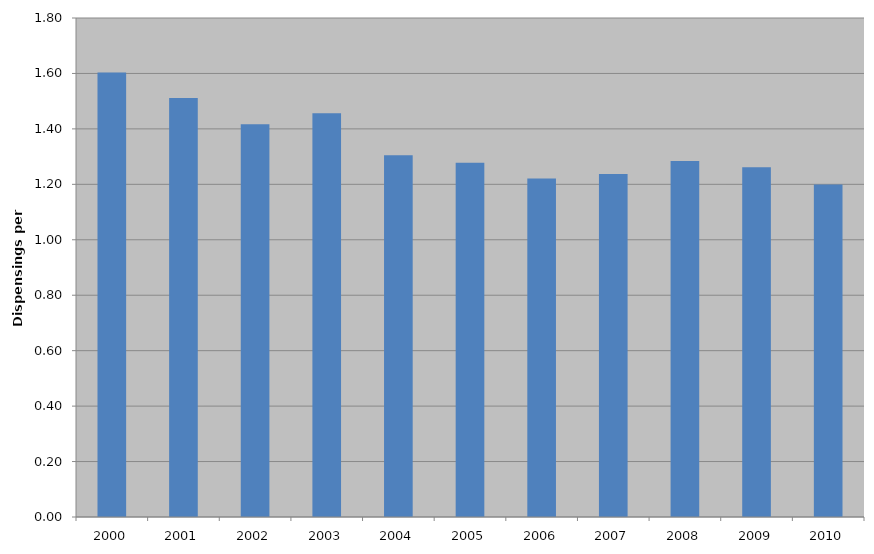
| Category | Total |
|---|---|
| 2000 | 1.603 |
| 2001 | 1.512 |
| 2002 | 1.416 |
| 2003 | 1.456 |
| 2004 | 1.305 |
| 2005 | 1.278 |
| 2006 | 1.221 |
| 2007 | 1.238 |
| 2008 | 1.284 |
| 2009 | 1.262 |
| 2010 | 1.2 |